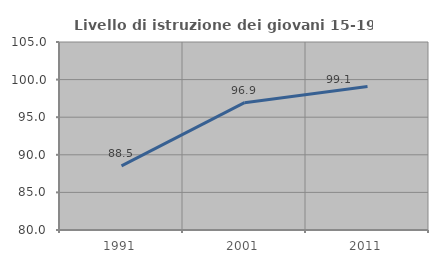
| Category | Livello di istruzione dei giovani 15-19 anni |
|---|---|
| 1991.0 | 88.535 |
| 2001.0 | 96.935 |
| 2011.0 | 99.091 |